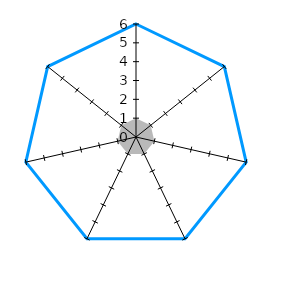
| Category | Series 0 | Series 1 |
|---|---|---|
| Ledelsesforankret | 6 | 1 |
| Tydeliggjort ansvar, myndighet og roller | 6 | 1 |
| Tilpasset virksomhetens egenart, risiko og vesentlighet | 6 | 1 |
| Integrert i virksomhetens styring, prosesser og aktiviteter | 6 | 1 |
| Formalisert og dokumentert, kommunisert og tilgjengeliggjort | 6 | 1 |
| Enhetlig og helhetlig | 6 | 1 |
| Etterlevd og systematisk fulgt opp | 6 | 1 |